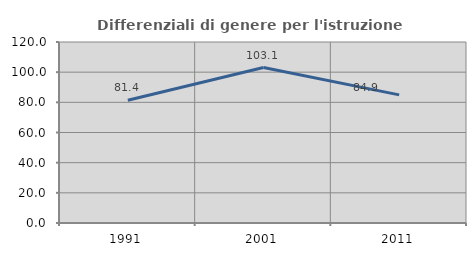
| Category | Differenziali di genere per l'istruzione superiore |
|---|---|
| 1991.0 | 81.419 |
| 2001.0 | 103.086 |
| 2011.0 | 84.939 |